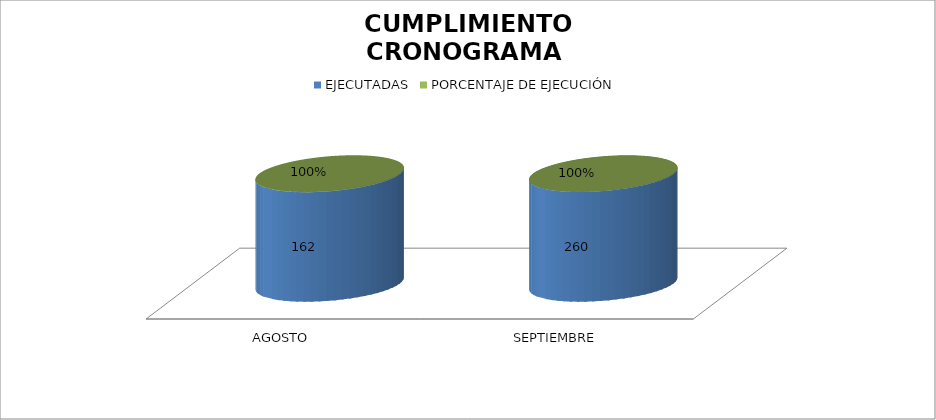
| Category | EJECUTADAS | PORCENTAJE DE EJECUCIÓN |
|---|---|---|
| AGOSTO | 162 | 1 |
| SEPTIEMBRE | 260 | 1 |